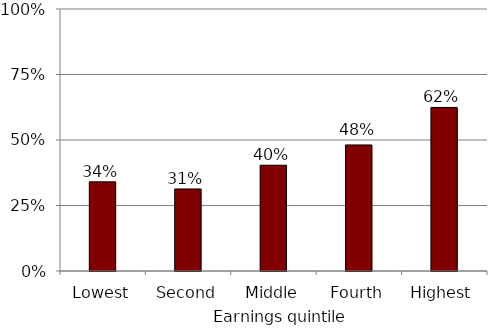
| Category | Series 2 |
|---|---|
| Lowest | 0.34 |
| Second | 0.313 |
| Middle | 0.404 |
| Fourth | 0.481 |
| Highest | 0.624 |